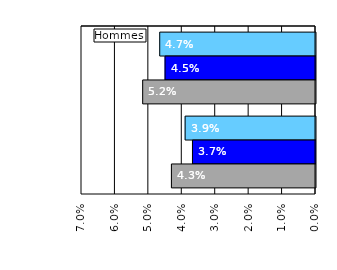
| Category | 2020 | 2021 | 2022 |
|---|---|---|---|
| Non-résidents | 0.047 | 0.045 | 0.052 |
|  Résidents     | 0.039 | 0.037 | 0.043 |